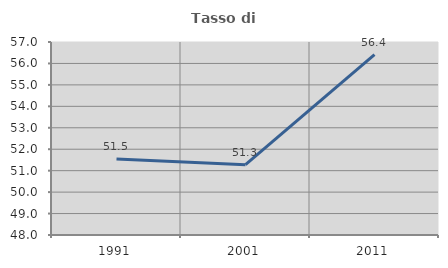
| Category | Tasso di occupazione   |
|---|---|
| 1991.0 | 51.538 |
| 2001.0 | 51.278 |
| 2011.0 | 56.407 |